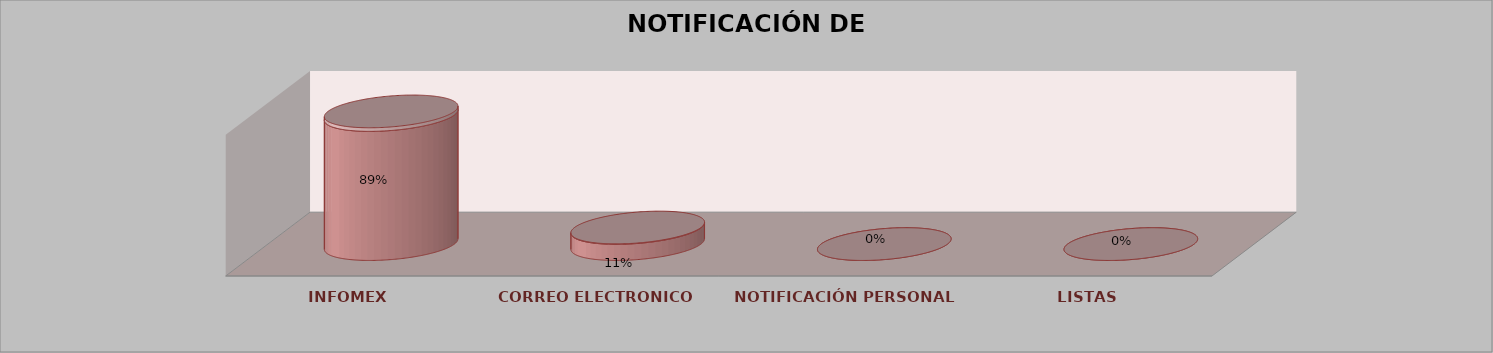
| Category | Series 0 | Series 1 | Series 2 | Series 3 | Series 4 |
|---|---|---|---|---|---|
| INFOMEX |  |  |  | 32 | 0.889 |
| CORREO ELECTRONICO |  |  |  | 4 | 0.111 |
| NOTIFICACIÓN PERSONAL |  |  |  | 0 | 0 |
| LISTAS |  |  |  | 0 | 0 |